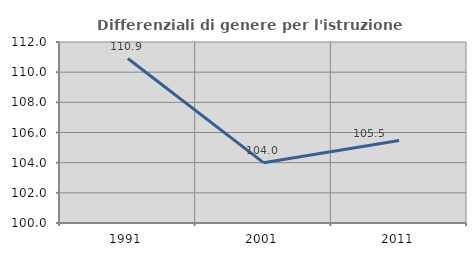
| Category | Differenziali di genere per l'istruzione superiore |
|---|---|
| 1991.0 | 110.902 |
| 2001.0 | 104.001 |
| 2011.0 | 105.474 |